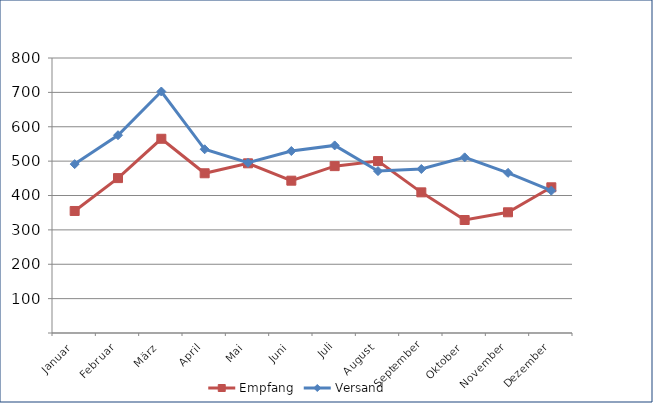
| Category | Empfang | Versand |
|---|---|---|
| Januar | 354.972 | 491.304 |
| Februar | 450.591 | 575.349 |
| März | 565.042 | 702.524 |
| April | 464.652 | 534.457 |
| Mai | 493.598 | 495.221 |
| Juni | 443.094 | 529.404 |
| Juli | 485.411 | 545.695 |
| August | 500.171 | 471.03 |
| September | 409.139 | 477.11 |
| Oktober | 328.71 | 510.981 |
| November | 351.171 | 465.88 |
| Dezember | 423.859 | 414.207 |